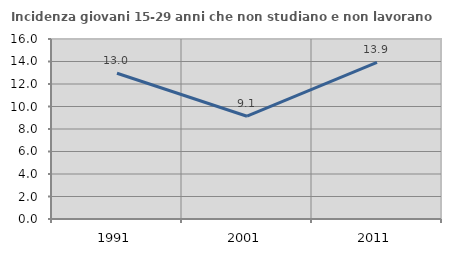
| Category | Incidenza giovani 15-29 anni che non studiano e non lavorano  |
|---|---|
| 1991.0 | 12.957 |
| 2001.0 | 9.137 |
| 2011.0 | 13.93 |